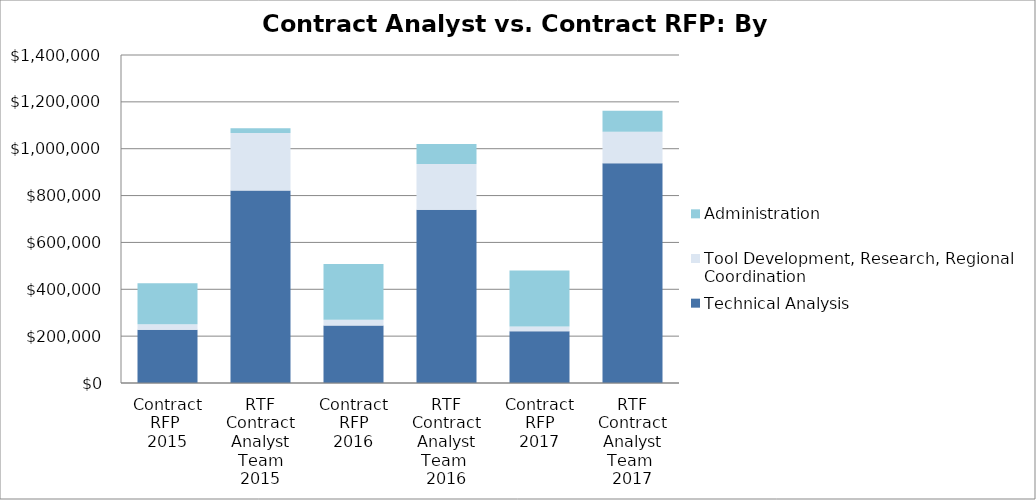
| Category | Technical Analysis | Tool Development, Research, Regional Coordination  | Administration |
|---|---|---|---|
| Contract RFP 
2015 | 227500 | 23000 | 175100 |
| RTF Contract Analyst Team 2015 | 822000 | 245000 | 20000 |
| Contract RFP
2016 | 245500 | 25000 | 237500 |
| RTF Contract Analyst Team 
2016 | 740000 | 195000 | 85000 |
| Contract RFP
2017 | 221000 | 20000 | 239300 |
| RTF Contract Analyst Team 
2017 | 937500 | 135000 | 90000 |